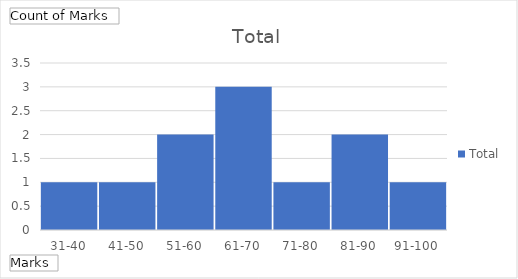
| Category | Total |
|---|---|
| 31-40 | 1 |
| 41-50 | 1 |
| 51-60 | 2 |
| 61-70 | 3 |
| 71-80 | 1 |
| 81-90 | 2 |
| 91-100 | 1 |